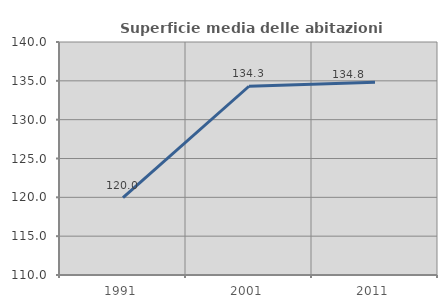
| Category | Superficie media delle abitazioni occupate |
|---|---|
| 1991.0 | 119.965 |
| 2001.0 | 134.303 |
| 2011.0 | 134.804 |